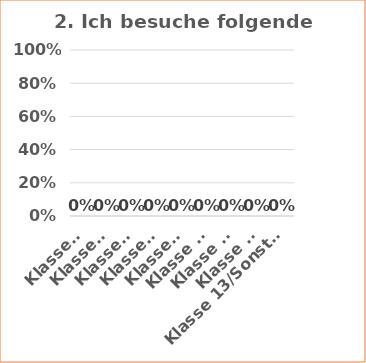
| Category | Series 1 |
|---|---|
| Klasse 5 | 0 |
| Klasse 6 | 0 |
| Klasse 7 | 0 |
| Klasse 8 | 0 |
| Klasse 9 | 0 |
| Klasse 10 | 0 |
| Klasse 11 | 0 |
| Klasse 12 | 0 |
| Klasse 13/Sonstige | 0 |